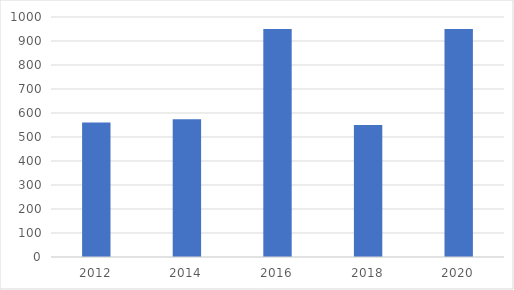
| Category | Series 0 |
|---|---|
| 2012.0 | 560 |
| 2014.0 | 574 |
| 2016.0 | 950 |
| 2018.0 | 550 |
| 2020.0 | 950 |